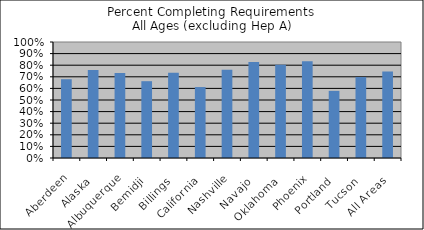
| Category | % Comp. Req. |
|---|---|
| Aberdeen | 0.679 |
| Alaska | 0.758 |
| Albuquerque | 0.734 |
| Bemidji | 0.662 |
| Billings | 0.736 |
| California | 0.611 |
| Nashville | 0.762 |
| Navajo | 0.828 |
| Oklahoma | 0.804 |
| Phoenix | 0.833 |
| Portland | 0.579 |
| Tucson | 0.698 |
| All Areas | 0.745 |